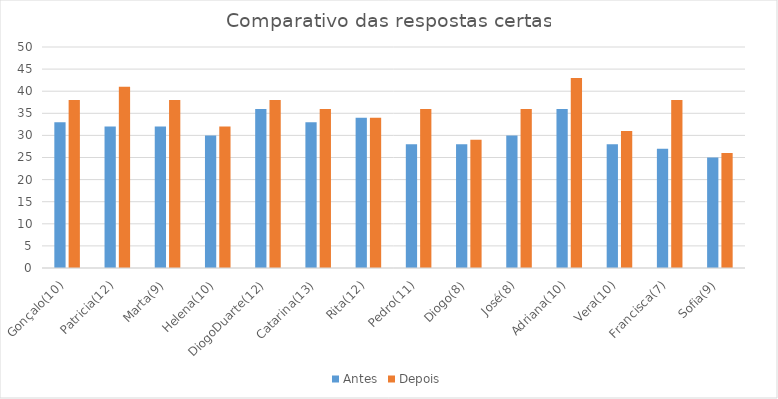
| Category | Antes | Depois |
|---|---|---|
| Gonçalo(10) | 33 | 38 |
| Patricia(12) | 32 | 41 |
| Marta(9) | 32 | 38 |
| Helena(10) | 30 | 32 |
| DiogoDuarte(12) | 36 | 38 |
| Catarina(13) | 33 | 36 |
| Rita(12) | 34 | 34 |
| Pedro(11) | 28 | 36 |
| Diogo(8) | 28 | 29 |
| José(8) | 30 | 36 |
| Adriana(10) | 36 | 43 |
| Vera(10) | 28 | 31 |
| Francisca(7) | 27 | 38 |
| Sofia(9) | 25 | 26 |